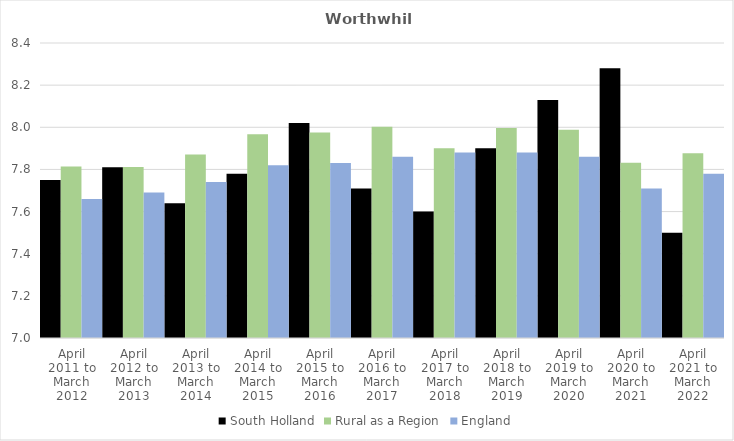
| Category | South Holland | Rural as a Region | England |
|---|---|---|---|
| April 2011 to March 2012 | 7.75 | 7.813 | 7.66 |
| April 2012 to March 2013 | 7.81 | 7.811 | 7.69 |
| April 2013 to March 2014 | 7.64 | 7.871 | 7.74 |
| April 2014 to March 2015 | 7.78 | 7.967 | 7.82 |
| April 2015 to March 2016 | 8.02 | 7.975 | 7.83 |
| April 2016 to March 2017 | 7.71 | 8.002 | 7.86 |
| April 2017 to March 2018 | 7.6 | 7.9 | 7.88 |
| April 2018 to March 2019 | 7.9 | 7.996 | 7.88 |
| April 2019 to March 2020 | 8.13 | 7.988 | 7.86 |
| April 2020 to March 2021 | 8.28 | 7.831 | 7.71 |
| April 2021 to March 2022 | 7.5 | 7.877 | 7.78 |